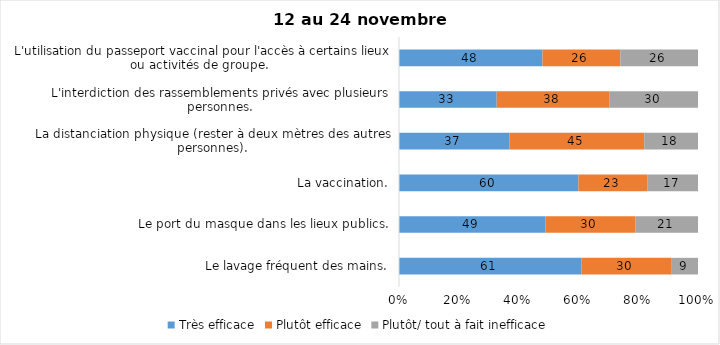
| Category | Très efficace | Plutôt efficace | Plutôt/ tout à fait inefficace |
|---|---|---|---|
| Le lavage fréquent des mains. | 61 | 30 | 9 |
| Le port du masque dans les lieux publics. | 49 | 30 | 21 |
| La vaccination. | 60 | 23 | 17 |
| La distanciation physique (rester à deux mètres des autres personnes). | 37 | 45 | 18 |
| L'interdiction des rassemblements privés avec plusieurs personnes. | 33 | 38 | 30 |
| L'utilisation du passeport vaccinal pour l'accès à certains lieux ou activités de groupe.  | 48 | 26 | 26 |